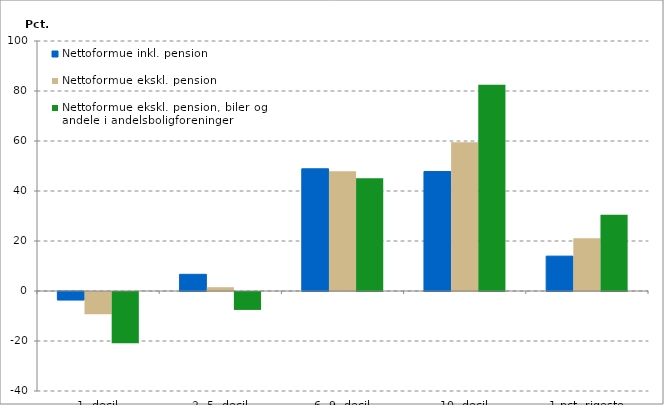
| Category | Nettoformue inkl. pension | Nettoformue ekskl. pension | Nettoformue ekskl. pension, biler og andele i andelsboligforeninger |
|---|---|---|---|
| 1. decil | -3.338 | -8.897 | -20.454 |
| 2.-5. decil | 6.677 | 1.512 | -7.169 |
| 6.-9. decil | 48.876 | 47.887 | 45.131 |
| 10. decil | 47.785 | 59.498 | 82.492 |
| 1 pct. rigeste | 13.945 | 21.139 | 30.454 |